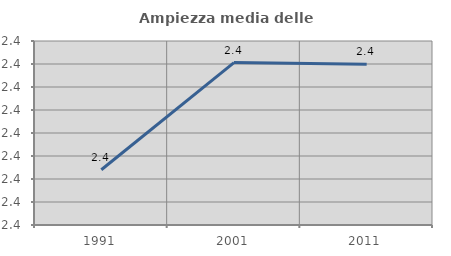
| Category | Ampiezza media delle famiglie |
|---|---|
| 1991.0 | 2.384 |
| 2001.0 | 2.431 |
| 2011.0 | 2.43 |